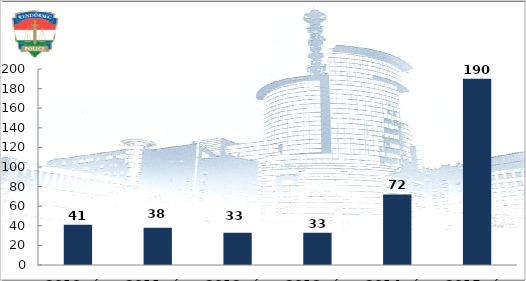
| Category | Szándékos bűncselekmény elkövetésén tettenérés miatti elfogások száma |
|---|---|
| 2010. év | 41 |
| 2011. év | 38 |
| 2012. év | 33 |
| 2013. év | 33 |
| 2014. év | 72 |
| 2015. év | 190 |